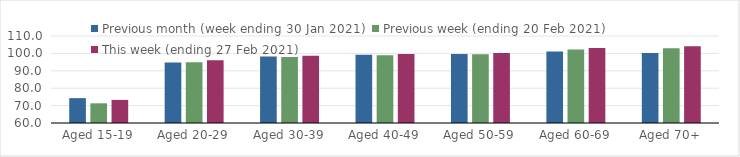
| Category | Previous month (week ending 30 Jan 2021) | Previous week (ending 20 Feb 2021) | This week (ending 27 Feb 2021) |
|---|---|---|---|
| Aged 15-19 | 74.29 | 71.31 | 73.27 |
| Aged 20-29 | 94.84 | 94.94 | 96.13 |
| Aged 30-39 | 98.27 | 97.92 | 98.6 |
| Aged 40-49 | 99.18 | 98.9 | 99.59 |
| Aged 50-59 | 99.65 | 99.58 | 100.28 |
| Aged 60-69 | 101.09 | 102.27 | 103.13 |
| Aged 70+ | 100.29 | 102.92 | 104.13 |